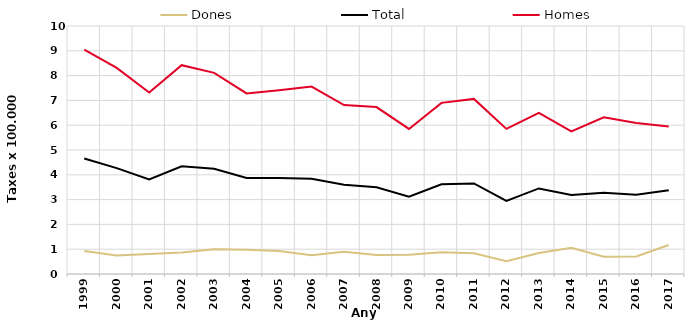
| Category | Dones | Total | Homes |
|---|---|---|---|
| 1999.0 | 0.93 | 4.66 | 9.05 |
| 2000.0 | 0.75 | 4.27 | 8.31 |
| 2001.0 | 0.81 | 3.81 | 7.32 |
| 2002.0 | 0.87 | 4.34 | 8.42 |
| 2003.0 | 1 | 4.24 | 8.11 |
| 2004.0 | 0.98 | 3.87 | 7.28 |
| 2005.0 | 0.93 | 3.87 | 7.41 |
| 2006.0 | 0.76 | 3.84 | 7.56 |
| 2007.0 | 0.9 | 3.6 | 6.81 |
| 2008.0 | 0.77 | 3.5 | 6.73 |
| 2009.0 | 0.78 | 3.12 | 5.85 |
| 2010.0 | 0.88 | 3.62 | 6.9 |
| 2011.0 | 0.84 | 3.65 | 7.06 |
| 2012.0 | 0.52 | 2.95 | 5.85 |
| 2013.0 | 0.85 | 3.45 | 6.5 |
| 2014.0 | 1.06 | 3.19 | 5.75 |
| 2015.0 | 0.7 | 3.28 | 6.32 |
| 2016.0 | 0.71 | 3.2 | 6.09 |
| 2017.0 | 1.17 | 3.38 | 5.95 |